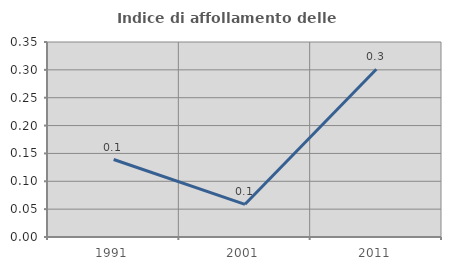
| Category | Indice di affollamento delle abitazioni  |
|---|---|
| 1991.0 | 0.139 |
| 2001.0 | 0.059 |
| 2011.0 | 0.301 |